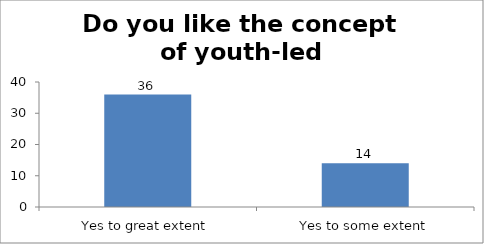
| Category | Do you like the concept of youth-led changemaking?  |
|---|---|
| Yes to great extent | 36 |
| Yes to some extent | 14 |